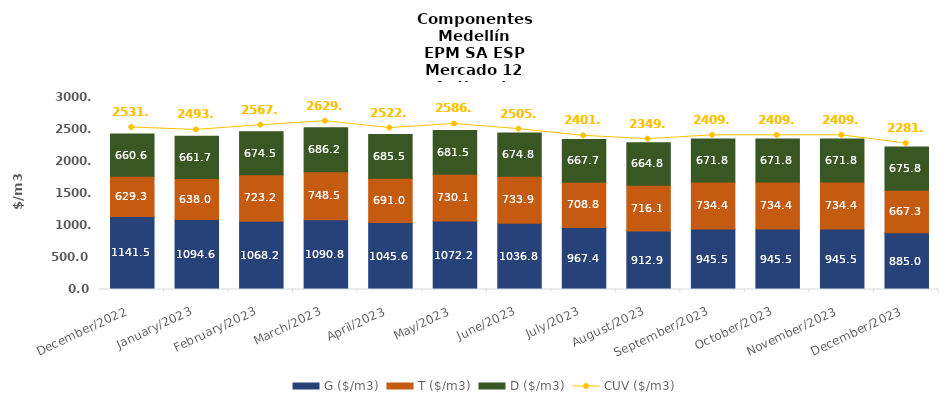
| Category | G ($/m3) | T ($/m3) | D ($/m3) |
|---|---|---|---|
| 2022-12-01 | 1141.53 | 629.26 | 660.56 |
| 2023-01-01 | 1094.64 | 637.95 | 661.67 |
| 2023-02-01 | 1068.19 | 723.22 | 674.52 |
| 2023-03-01 | 1090.77 | 748.48 | 686.22 |
| 2023-04-01 | 1045.58 | 690.98 | 685.49 |
| 2023-05-01 | 1072.19 | 730.14 | 681.45 |
| 2023-06-01 | 1036.8 | 733.9 | 674.81 |
| 2023-07-01 | 967.35 | 708.84 | 667.66 |
| 2023-08-01 | 912.93 | 716.07 | 664.76 |
| 2023-09-01 | 945.5 | 734.35 | 671.79 |
| 2023-10-01 | 945.5 | 734.35 | 671.79 |
| 2023-11-01 | 945.5 | 734.35 | 671.79 |
| 2023-12-01 | 884.98 | 667.31 | 675.79 |